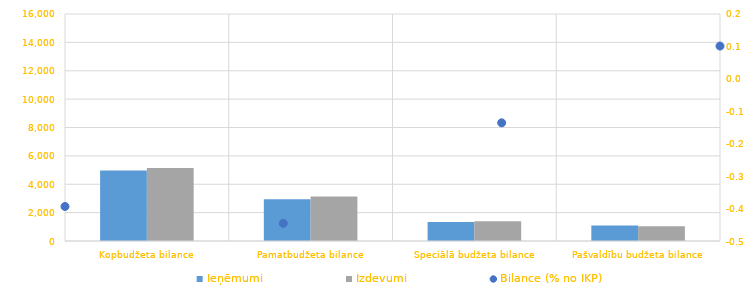
| Category | Ieņēmumi | Izdevumi |
|---|---|---|
| Kopbudžeta bilance | 4977488.988 | 5149202.064 |
| Pamatbudžeta bilance | 2940675.255 | 3135178.973 |
| Speciālā budžeta bilance | 1340413.698 | 1399562.621 |
| Pašvaldību budžeta bilance | 1087247.409 | 1043083.349 |